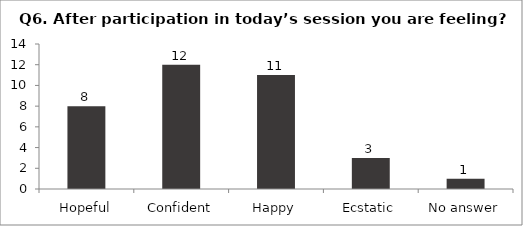
| Category | Q6. After participation in today’s session you are feeling? |
|---|---|
| Hopeful | 8 |
| Confident | 12 |
| Happy | 11 |
| Ecstatic | 3 |
| No answer | 1 |